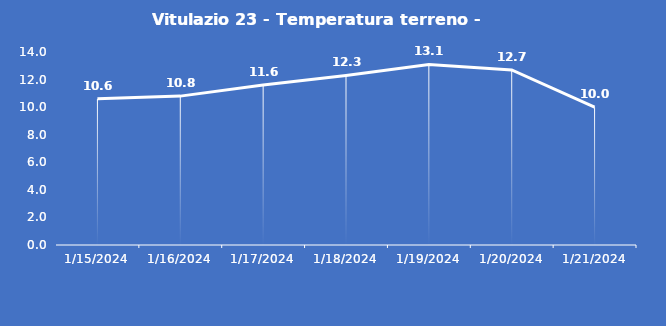
| Category | Vitulazio 23 - Temperatura terreno - Grezzo (°C) |
|---|---|
| 1/15/24 | 10.6 |
| 1/16/24 | 10.8 |
| 1/17/24 | 11.6 |
| 1/18/24 | 12.3 |
| 1/19/24 | 13.1 |
| 1/20/24 | 12.7 |
| 1/21/24 | 10 |